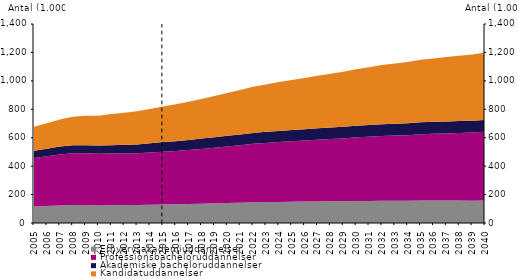
| Category | Erhvervsakademiuddannelser | Professionsbacheloruddannelser | Akademiske bacheloruddannelser | Kandidatuddannelser |
|---|---|---|---|---|
| 2005.0 | 116095 | 341797 | 49576 | 170434 |
| 2006.0 | 119542 | 350101 | 52406 | 179515 |
| 2007.0 | 123576 | 359174 | 55283 | 190312 |
| 2008.0 | 126295 | 364361 | 57186 | 200141 |
| 2009.0 | 126669 | 363971 | 56945 | 206726 |
| 2010.0 | 123649 | 363202 | 57573 | 210689 |
| 2011.0 | 124464 | 363798 | 59368 | 219214 |
| 2012.0 | 125833 | 363200 | 60845 | 226253 |
| 2013.0 | 126664 | 363981 | 62244 | 233463 |
| 2014.0 | 128147 | 367488 | 64697 | 241790 |
| 2015.0 | 130148 | 371750 | 67217 | 250284 |
| 2016.0 | 131422.121 | 374233.023 | 70203.575 | 259569.315 |
| 2017.0 | 133830.779 | 379197.879 | 71637.977 | 268752.896 |
| 2018.0 | 136229.885 | 384980.436 | 72800.989 | 278739.805 |
| 2019.0 | 138605.772 | 390826.587 | 73926.317 | 289260.886 |
| 2020.0 | 140925.851 | 397638.176 | 75201.208 | 300942.586 |
| 2021.0 | 143121.426 | 404144.194 | 76208.909 | 312978.354 |
| 2022.0 | 145303.937 | 411426.883 | 77045.976 | 324195.601 |
| 2023.0 | 147005.622 | 416453.876 | 77746.473 | 333969.657 |
| 2024.0 | 148470.613 | 420959.176 | 78406.869 | 343272.848 |
| 2025.0 | 149735.308 | 425158.092 | 79055.765 | 352053.452 |
| 2026.0 | 150820.879 | 429210.517 | 79680.901 | 360514.421 |
| 2027.0 | 151987.556 | 433958.793 | 80343.725 | 369396.094 |
| 2028.0 | 152793.161 | 437930.373 | 80942.096 | 378380.691 |
| 2029.0 | 153424.712 | 441564.091 | 81497.349 | 387462.201 |
| 2030.0 | 154744.542 | 447727.444 | 82218.348 | 397439.692 |
| 2031.0 | 155449.796 | 451793.07 | 82759.956 | 406481.346 |
| 2032.0 | 156178.688 | 456071.17 | 83291.436 | 415404.475 |
| 2033.0 | 156444.584 | 459048.952 | 83593.667 | 423682.743 |
| 2034.0 | 156528.87 | 461503.155 | 83749.224 | 431076.854 |
| 2035.0 | 157505.23 | 466924.773 | 84105.817 | 439729.653 |
| 2036.0 | 157572.097 | 469838.66 | 84093.372 | 446546.696 |
| 2037.0 | 157556.218 | 472837.906 | 84024.429 | 453329.721 |
| 2038.0 | 157447.829 | 475835.518 | 83930.054 | 459710.054 |
| 2039.0 | 157294.214 | 478636.98 | 83877.695 | 465815.382 |
| 2040.0 | 158117.065 | 483662.925 | 84182.252 | 473075.594 |